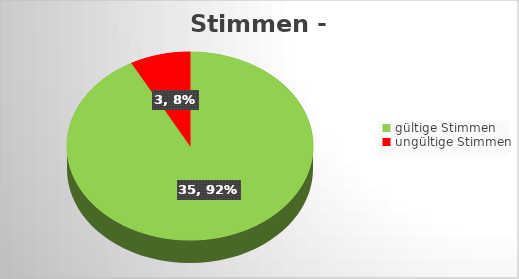
| Category | Series 0 |
|---|---|
| gültige Stimmen | 35 |
| ungültige Stimmen | 3 |